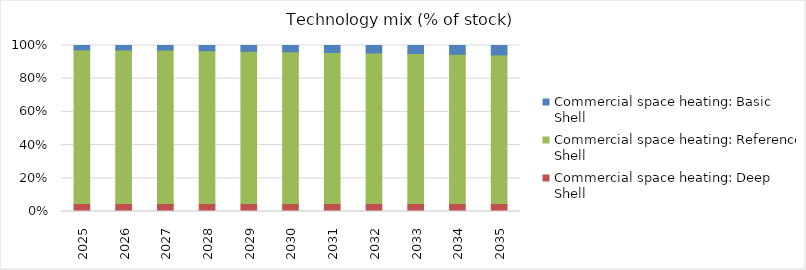
| Category | Commercial space heating: Deep Shell | Commercial space heating: Reference Shell | Commercial space heating: Basic Shell |
|---|---|---|---|
| 2025.0 | 0.048 | 0.926 | 0.026 |
| 2026.0 | 0.048 | 0.925 | 0.027 |
| 2027.0 | 0.048 | 0.924 | 0.028 |
| 2028.0 | 0.048 | 0.921 | 0.032 |
| 2029.0 | 0.048 | 0.917 | 0.035 |
| 2030.0 | 0.048 | 0.914 | 0.038 |
| 2031.0 | 0.048 | 0.91 | 0.042 |
| 2032.0 | 0.048 | 0.907 | 0.045 |
| 2033.0 | 0.048 | 0.903 | 0.049 |
| 2034.0 | 0.048 | 0.899 | 0.053 |
| 2035.0 | 0.048 | 0.895 | 0.057 |